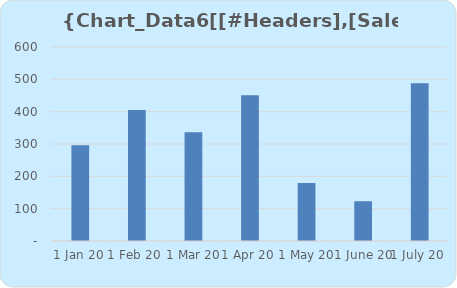
| Category | Sales |
|---|---|
| 2020-01-01 | 296 |
| 2020-02-01 | 405 |
| 2020-03-01 | 336 |
| 2020-04-01 | 451 |
| 2020-05-01 | 179 |
| 2020-06-01 | 123 |
| 2020-07-01 | 488 |